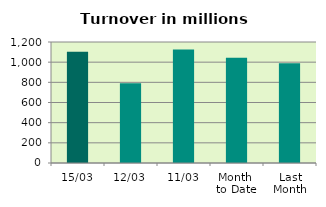
| Category | Series 0 |
|---|---|
| 15/03 | 1102.095 |
| 12/03 | 789.978 |
| 11/03 | 1126.169 |
| Month 
to Date | 1044.238 |
| Last
Month | 989.924 |